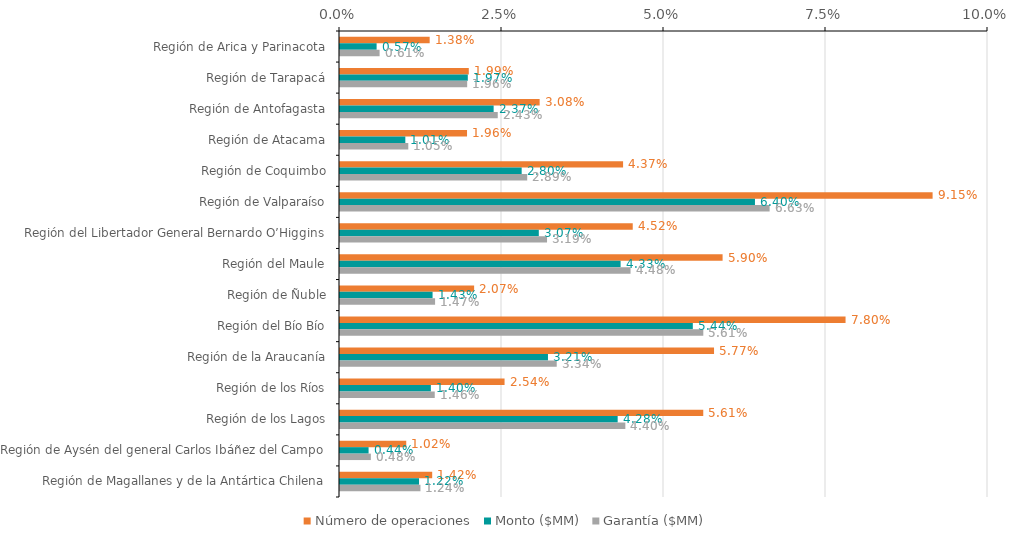
| Category | Número de operaciones | Monto ($MM) | Garantía ($MM) |
|---|---|---|---|
| Región de Arica y Parinacota | 0.014 | 0.006 | 0.006 |
| Región de Tarapacá | 0.02 | 0.02 | 0.02 |
| Región de Antofagasta | 0.031 | 0.024 | 0.024 |
| Región de Atacama | 0.02 | 0.01 | 0.011 |
| Región de Coquimbo | 0.044 | 0.028 | 0.029 |
| Región de Valparaíso | 0.091 | 0.064 | 0.066 |
| Región del Libertador General Bernardo O’Higgins | 0.045 | 0.031 | 0.032 |
| Región del Maule | 0.059 | 0.043 | 0.045 |
| Región de Ñuble | 0.021 | 0.014 | 0.015 |
| Región del Bío Bío | 0.078 | 0.054 | 0.056 |
| Región de la Araucanía | 0.058 | 0.032 | 0.033 |
| Región de los Ríos | 0.025 | 0.014 | 0.015 |
| Región de los Lagos | 0.056 | 0.043 | 0.044 |
| Región de Aysén del general Carlos Ibáñez del Campo | 0.01 | 0.004 | 0.005 |
| Región de Magallanes y de la Antártica Chilena | 0.014 | 0.012 | 0.012 |